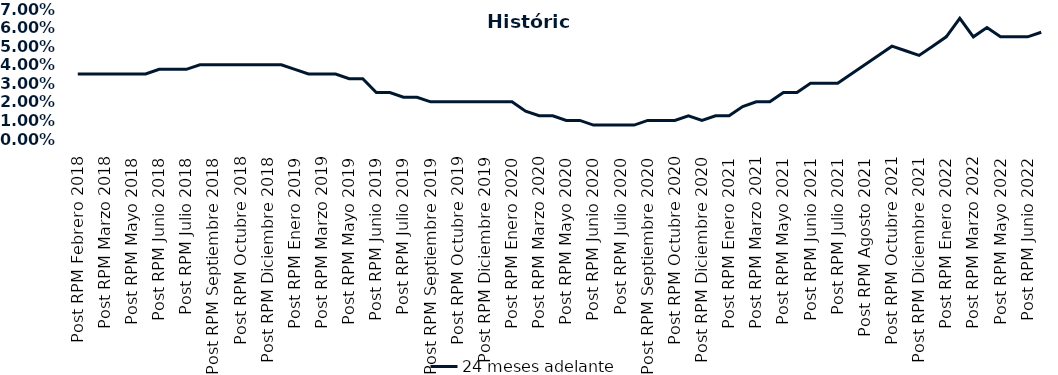
| Category | 24 meses adelante  |
|---|---|
| Post RPM Febrero 2018 | 0.035 |
| Pre RPM Marzo 2018 | 0.035 |
| Post RPM Marzo 2018 | 0.035 |
| Pre RPM Mayo 2018 | 0.035 |
| Post RPM Mayo 2018 | 0.035 |
| Pre RPM Junio 2018 | 0.035 |
| Post RPM Junio 2018 | 0.038 |
| Pre RPM Julio 2018 | 0.038 |
| Post RPM Julio 2018 | 0.038 |
| Pre RPM Septiembre 2018 | 0.04 |
| Post RPM Septiembre 2018 | 0.04 |
| Pre RPM Octubre 2018 | 0.04 |
| Post RPM Octubre 2018 | 0.04 |
| Pre RPM Diciembre 2018 | 0.04 |
| Post RPM Diciembre 2018 | 0.04 |
| Pre RPM Enero 2019 | 0.04 |
| Post RPM Enero 2019 | 0.038 |
| Pre RPM Marzo 2019 | 0.035 |
| Post RPM Marzo 2019 | 0.035 |
| Pre RPM Mayo 2019 | 0.035 |
| Post RPM Mayo 2019 | 0.032 |
| Pre RPM Junio 2019 | 0.032 |
| Post RPM Junio 2019 | 0.025 |
| Pre RPM Julio 2019 | 0.025 |
| Post RPM Julio 2019 | 0.022 |
| Pre RPM Septiembre 2019 | 0.022 |
| Post RPM Septiembre 2019 | 0.02 |
| Pre RPM Octubre 2019 | 0.02 |
| Post RPM Octubre 2019 | 0.02 |
| Pre RPM Diciembre 2019 | 0.02 |
| Post RPM Diciembre 2019 | 0.02 |
| Pre RPM Enero 2020 | 0.02 |
| Post RPM Enero 2020 | 0.02 |
| Pre RPM Marzo 2020 | 0.015 |
| Post RPM Marzo 2020 | 0.012 |
| Pre RPM Mayo 2020 | 0.012 |
| Post RPM Mayo 2020 | 0.01 |
| Pre RPM Junio 2020 | 0.01 |
| Post RPM Junio 2020 | 0.008 |
| Pre RPM Julio 2020 | 0.008 |
| Post RPM Julio 2020 | 0.008 |
| Pre RPM Septiembre 2020 | 0.008 |
| Post RPM Septiembre 2020 | 0.01 |
| Pre RPM Octubre 2020 | 0.01 |
| Post RPM Octubre 2020 | 0.01 |
| Pre RPM Diciembre 2020 | 0.012 |
| Post RPM Diciembre 2020 | 0.01 |
| Pre RPM Enero 2021 | 0.012 |
| Post RPM Enero 2021 | 0.012 |
| Pre RPM Marzo 2021 | 0.018 |
| Post RPM Marzo 2021 | 0.02 |
| Pre RPM Mayo 2021 | 0.02 |
| Post RPM Mayo 2021 | 0.025 |
| Pre RPM Junio 2021 | 0.025 |
| Post RPM Junio 2021 | 0.03 |
| Pre RPM Julio 2021 | 0.03 |
| Post RPM Julio 2021 | 0.03 |
| Pre RPM Agosto 2021 | 0.035 |
| Post RPM Agosto 2021 | 0.04 |
| Pre RPM Octubre 2021 | 0.045 |
| Post RPM Octubre 2021 | 0.05 |
| Pre RPM Diciembre 2021 | 0.048 |
| Post RPM Diciembre 2021 | 0.045 |
| Pre RPM Enero 2022 | 0.05 |
| Post RPM Enero 2022 | 0.055 |
| Pre RPM Marzo 2022 | 0.065 |
| Post RPM Marzo 2022 | 0.055 |
| Pre RPM Mayo 2022 | 0.06 |
| Post RPM Mayo 2022 | 0.055 |
| Pre RPM Junio 2022 | 0.055 |
| Post RPM Junio 2022 | 0.055 |
| Pre RPM Julio 2022 | 0.058 |